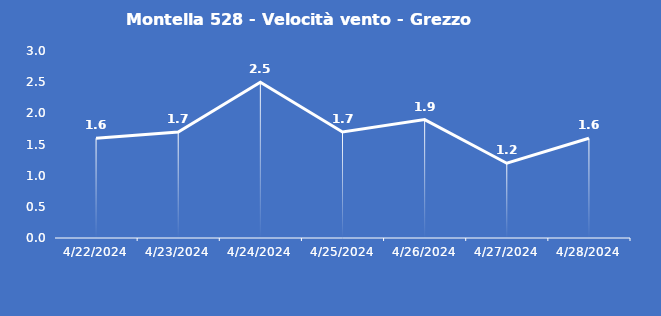
| Category | Montella 528 - Velocità vento - Grezzo (m/s) |
|---|---|
| 4/22/24 | 1.6 |
| 4/23/24 | 1.7 |
| 4/24/24 | 2.5 |
| 4/25/24 | 1.7 |
| 4/26/24 | 1.9 |
| 4/27/24 | 1.2 |
| 4/28/24 | 1.6 |